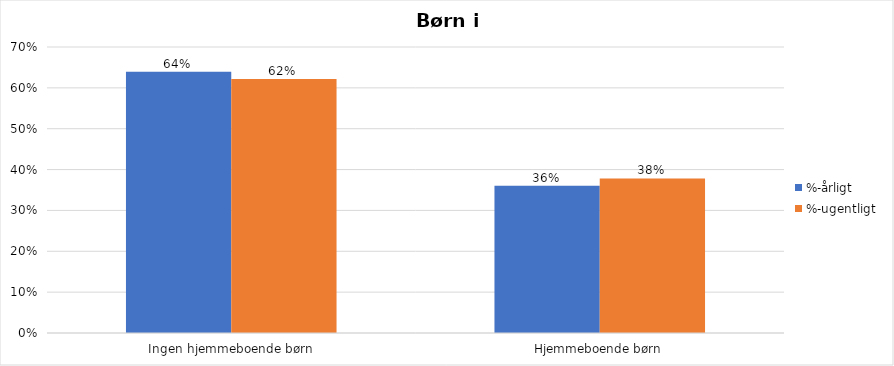
| Category | %-årligt | %-ugentligt |
|---|---|---|
| Ingen hjemmeboende børn | 0.639 | 0.622 |
| Hjemmeboende børn | 0.361 | 0.378 |